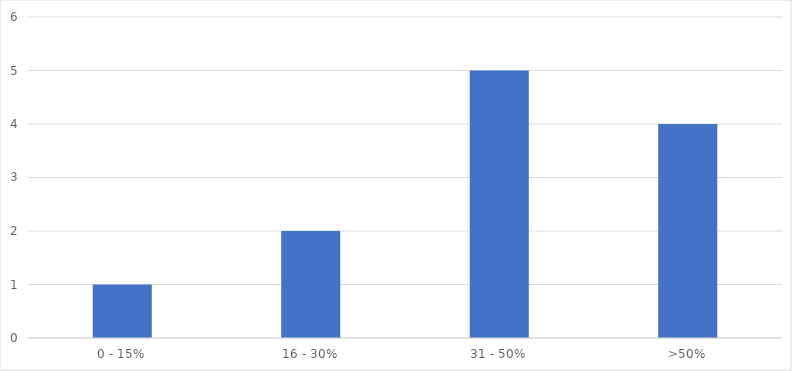
| Category | Number of Responses |
|---|---|
| 0 - 15% | 1 |
| 16 - 30% | 2 |
| 31 - 50% | 5 |
| >50% | 4 |